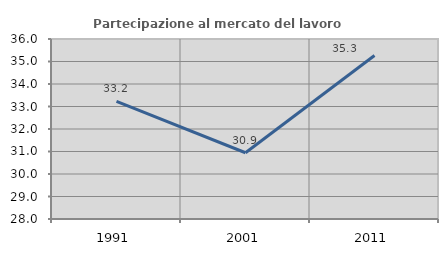
| Category | Partecipazione al mercato del lavoro  femminile |
|---|---|
| 1991.0 | 33.231 |
| 2001.0 | 30.944 |
| 2011.0 | 35.265 |